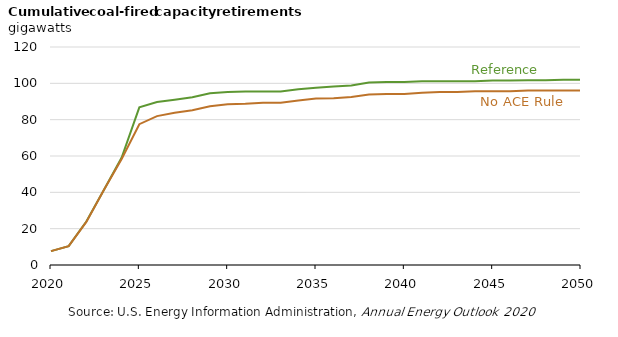
| Category | Reference | No ACE Rule |
|---|---|---|
| 2020.0 | 7.651 | 7.651 |
| 2021.0 | 10.386 | 10.386 |
| 2022.0 | 23.943 | 23.724 |
| 2023.0 | 41.405 | 41.47 |
| 2024.0 | 59.14 | 58.31 |
| 2025.0 | 86.781 | 77.508 |
| 2026.0 | 89.707 | 81.943 |
| 2027.0 | 90.985 | 83.826 |
| 2028.0 | 92.32 | 85.161 |
| 2029.0 | 94.575 | 87.416 |
| 2030.0 | 95.21 | 88.538 |
| 2031.0 | 95.442 | 88.77 |
| 2032.0 | 95.534 | 89.37 |
| 2033.0 | 95.534 | 89.37 |
| 2034.0 | 96.692 | 90.528 |
| 2035.0 | 97.568 | 91.6 |
| 2036.0 | 98.251 | 91.795 |
| 2037.0 | 98.785 | 92.525 |
| 2038.0 | 100.439 | 93.788 |
| 2039.0 | 100.778 | 94.127 |
| 2040.0 | 100.778 | 94.127 |
| 2041.0 | 101.118 | 94.837 |
| 2042.0 | 101.118 | 95.207 |
| 2043.0 | 101.118 | 95.207 |
| 2044.0 | 101.118 | 95.694 |
| 2045.0 | 101.533 | 95.694 |
| 2046.0 | 101.533 | 95.694 |
| 2047.0 | 101.765 | 96.109 |
| 2048.0 | 101.765 | 96.109 |
| 2049.0 | 101.99 | 96.109 |
| 2050.0 | 101.99 | 96.109 |